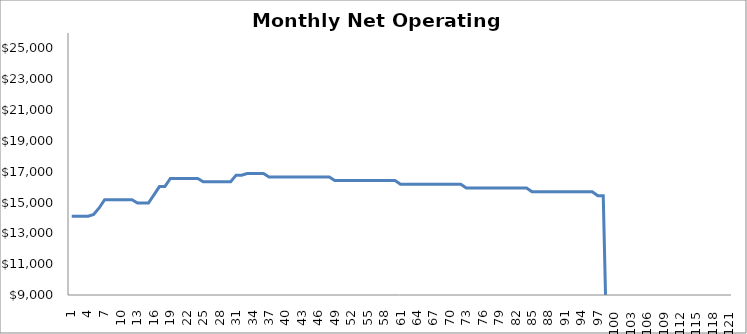
| Category | Series 0 |
|---|---|
| 0 | 14113.961 |
| 1 | 14113.961 |
| 2 | 14113.961 |
| 3 | 14113.961 |
| 4 | 14220.506 |
| 5 | 14646.687 |
| 6 | 15179.413 |
| 7 | 15179.413 |
| 8 | 15179.413 |
| 9 | 15179.413 |
| 10 | 15179.413 |
| 11 | 15179.413 |
| 12 | 14964.891 |
| 13 | 14964.891 |
| 14 | 14964.891 |
| 15 | 15498.599 |
| 16 | 16032.307 |
| 17 | 16032.307 |
| 18 | 16566.015 |
| 19 | 16566.015 |
| 20 | 16566.015 |
| 21 | 16566.015 |
| 22 | 16566.015 |
| 23 | 16566.015 |
| 24 | 16348.091 |
| 25 | 16348.091 |
| 26 | 16348.091 |
| 27 | 16348.091 |
| 28 | 16348.091 |
| 29 | 16348.091 |
| 30 | 16775.866 |
| 31 | 16775.866 |
| 32 | 16882.81 |
| 33 | 16882.81 |
| 34 | 16882.81 |
| 35 | 16882.81 |
| 36 | 16659.391 |
| 37 | 16659.391 |
| 38 | 16659.391 |
| 39 | 16659.391 |
| 40 | 16659.391 |
| 41 | 16659.391 |
| 42 | 16659.391 |
| 43 | 16659.391 |
| 44 | 16659.391 |
| 45 | 16659.391 |
| 46 | 16659.391 |
| 47 | 16659.391 |
| 48 | 16429.268 |
| 49 | 16429.268 |
| 50 | 16429.268 |
| 51 | 16429.268 |
| 52 | 16429.268 |
| 53 | 16429.268 |
| 54 | 16429.268 |
| 55 | 16429.268 |
| 56 | 16429.268 |
| 57 | 16429.268 |
| 58 | 16429.268 |
| 59 | 16429.268 |
| 60 | 16192.243 |
| 61 | 16192.243 |
| 62 | 16192.243 |
| 63 | 16192.243 |
| 64 | 16192.243 |
| 65 | 16192.243 |
| 66 | 16192.243 |
| 67 | 16192.243 |
| 68 | 16192.243 |
| 69 | 16192.243 |
| 70 | 16192.243 |
| 71 | 16192.243 |
| 72 | 15948.106 |
| 73 | 15948.106 |
| 74 | 15948.106 |
| 75 | 15948.106 |
| 76 | 15948.106 |
| 77 | 15948.106 |
| 78 | 15948.106 |
| 79 | 15948.106 |
| 80 | 15948.106 |
| 81 | 15948.106 |
| 82 | 15948.106 |
| 83 | 15948.106 |
| 84 | 15696.646 |
| 85 | 15696.646 |
| 86 | 15696.646 |
| 87 | 15696.646 |
| 88 | 15696.646 |
| 89 | 15696.646 |
| 90 | 15696.646 |
| 91 | 15696.646 |
| 92 | 15696.646 |
| 93 | 15696.646 |
| 94 | 15696.646 |
| 95 | 15696.646 |
| 96 | 15437.641 |
| 97 | 15437.641 |
| 98 | 0 |
| 99 | 0 |
| 100 | 0 |
| 101 | 0 |
| 102 | 0 |
| 103 | 0 |
| 104 | 0 |
| 105 | 0 |
| 106 | 0 |
| 107 | 0 |
| 108 | 0 |
| 109 | 0 |
| 110 | 0 |
| 111 | 0 |
| 112 | 0 |
| 113 | 0 |
| 114 | 0 |
| 115 | 0 |
| 116 | 0 |
| 117 | 0 |
| 118 | 0 |
| 119 | 0 |
| 120 | 0 |